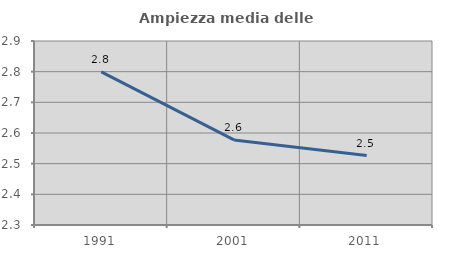
| Category | Ampiezza media delle famiglie |
|---|---|
| 1991.0 | 2.8 |
| 2001.0 | 2.577 |
| 2011.0 | 2.527 |